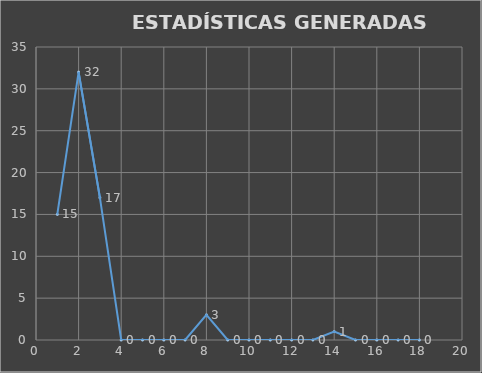
| Category |                   ESTADÍSTICAS GENERADAS  |
|---|---|
| 0 | 15 |
| 1 | 32 |
| 2 | 17 |
| 3 | 0 |
| 4 | 0 |
| 5 | 0 |
| 6 | 0 |
| 7 | 3 |
| 8 | 0 |
| 9 | 0 |
| 10 | 0 |
| 11 | 0 |
| 12 | 0 |
| 13 | 1 |
| 14 | 0 |
| 15 | 0 |
| 16 | 0 |
| 17 | 0 |